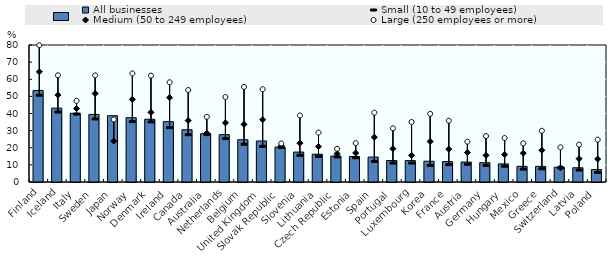
| Category | All businesses |
|---|---|
| Finland | 53.453 |
| Iceland | 43.13 |
| Italy | 40.102 |
| Sweden | 39.444 |
| Japan | 38.7 |
| Norway | 37.557 |
| Denmark | 36.647 |
| Ireland | 35.239 |
| Canada | 30.5 |
| Australia | 28.178 |
| Netherlands | 27.655 |
| Belgium | 24.691 |
| United Kingdom | 23.966 |
| Slovak Republic | 20.41 |
| Slovenia | 17.494 |
| Lithuania | 16.243 |
| Czech Republic | 15.133 |
| Estonia | 14.852 |
| Spain | 14.56 |
| Portugal | 12.559 |
| Luxembourg | 12.518 |
| Korea | 12.13 |
| France | 11.906 |
| Austria | 11.669 |
| Germany | 11.29 |
| Hungary | 10.56 |
| Mexico | 9.148 |
| Greece | 9.128 |
| Switzerland | 8.646 |
| Latvia | 8.312 |
| Poland | 7.279 |